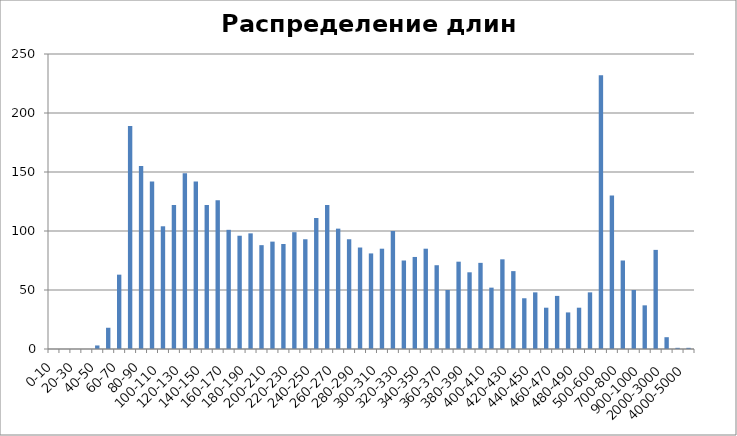
| Category | Распределение длин белков |
|---|---|
| 0-10 | 0 |
| 10-20 | 0 |
| 20-30 | 0 |
| 30-40 | 0 |
| 40-50 | 3 |
| 50-60 | 18 |
| 60-70 | 63 |
| 70-80 | 189 |
| 80-90 | 155 |
| 90-100 | 142 |
| 100-110 | 104 |
| 110-120 | 122 |
| 120-130 | 149 |
| 130-140 | 142 |
| 140-150 | 122 |
| 150-160 | 126 |
| 160-170 | 101 |
| 170-180 | 96 |
| 180-190 | 98 |
| 190-200 | 88 |
| 200-210 | 91 |
| 210-220 | 89 |
| 220-230 | 99 |
| 230-240 | 93 |
| 240-250 | 111 |
| 250-260 | 122 |
| 260-270 | 102 |
| 270-280 | 93 |
| 280-290 | 86 |
| 290-300 | 81 |
| 300-310 | 85 |
| 310-320 | 100 |
| 320-330 | 75 |
| 330-340 | 78 |
| 340-350 | 85 |
| 350-360 | 71 |
| 360-370 | 50 |
| 370-380 | 74 |
| 380-390 | 65 |
| 390-400 | 73 |
| 400-410 | 52 |
| 410-420 | 76 |
| 420-430 | 66 |
| 430-440 | 43 |
| 440-450 | 48 |
| 450-460 | 35 |
| 460-470 | 45 |
| 470-480 | 31 |
| 480-490 | 35 |
| 490-500 | 48 |
| 500-600 | 232 |
| 600-700 | 130 |
| 700-800 | 75 |
| 800-900 | 50 |
| 900-1000 | 37 |
| 1000-2000 | 84 |
| 2000-3000 | 10 |
| 3000-4000 | 1 |
| 4000-5000 | 1 |